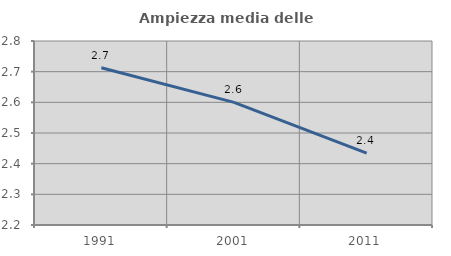
| Category | Ampiezza media delle famiglie |
|---|---|
| 1991.0 | 2.713 |
| 2001.0 | 2.6 |
| 2011.0 | 2.435 |